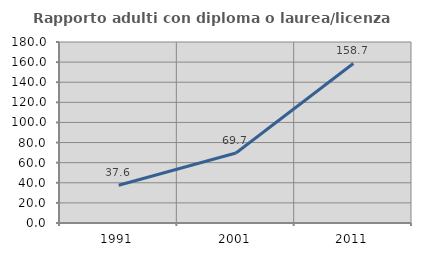
| Category | Rapporto adulti con diploma o laurea/licenza media  |
|---|---|
| 1991.0 | 37.559 |
| 2001.0 | 69.677 |
| 2011.0 | 158.678 |